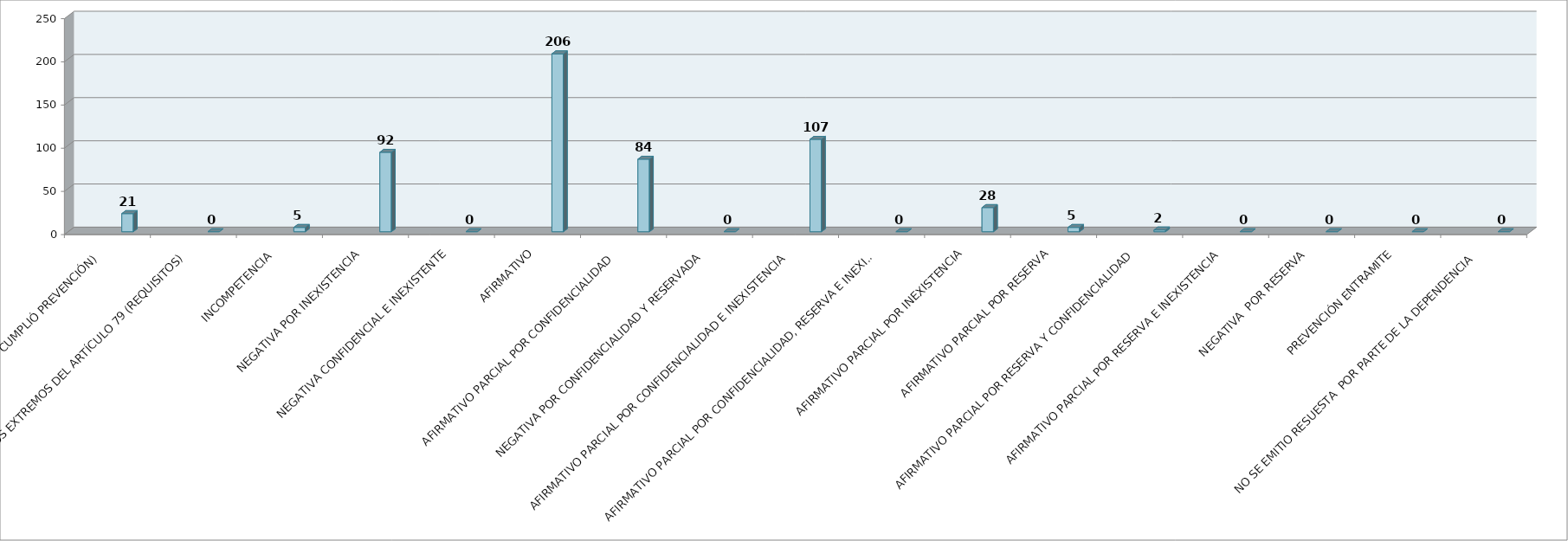
| Category | Series 0 | Series 1 | Series 2 | Series 3 | Series 4 | Series 5 |
|---|---|---|---|---|---|---|
| SE TIENE POR NO PRESENTADA ( NO CUMPLIÓ PREVENCIÓN) |  |  |  |  | 21 |  |
| NO CUMPLIO CON LOS EXTREMOS DEL ARTÍCULO 79 (REQUISITOS) |  |  |  |  | 0 |  |
| INCOMPETENCIA  |  |  |  |  | 5 |  |
| NEGATIVA POR INEXISTENCIA |  |  |  |  | 92 |  |
| NEGATIVA CONFIDENCIAL E INEXISTENTE |  |  |  |  | 0 |  |
| AFIRMATIVO |  |  |  |  | 206 |  |
| AFIRMATIVO PARCIAL POR CONFIDENCIALIDAD  |  |  |  |  | 84 |  |
| NEGATIVA POR CONFIDENCIALIDAD Y RESERVADA |  |  |  |  | 0 |  |
| AFIRMATIVO PARCIAL POR CONFIDENCIALIDAD E INEXISTENCIA |  |  |  |  | 107 |  |
| AFIRMATIVO PARCIAL POR CONFIDENCIALIDAD, RESERVA E INEXISTENCIA |  |  |  |  | 0 |  |
| AFIRMATIVO PARCIAL POR INEXISTENCIA |  |  |  |  | 28 |  |
| AFIRMATIVO PARCIAL POR RESERVA |  |  |  |  | 5 |  |
| AFIRMATIVO PARCIAL POR RESERVA Y CONFIDENCIALIDAD |  |  |  |  | 2 |  |
| AFIRMATIVO PARCIAL POR RESERVA E INEXISTENCIA |  |  |  |  | 0 |  |
| NEGATIVA  POR RESERVA |  |  |  |  | 0 |  |
| PREVENCIÓN ENTRAMITE |  |  |  |  | 0 |  |
| NO SE EMITIO RESUESTA  POR PARTE DE LA DEPENDENCIA |  |  |  |  | 0 |  |